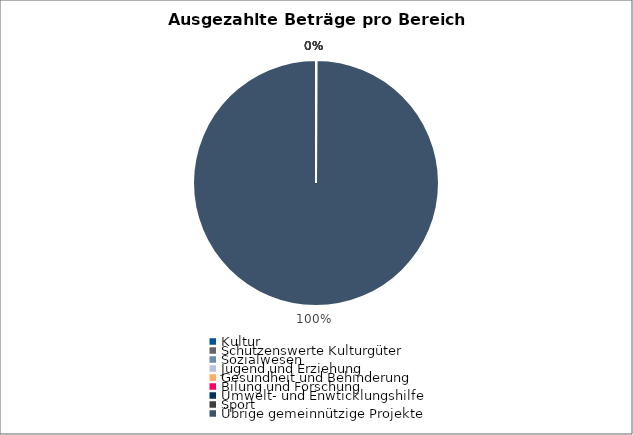
| Category | Series 0 |
|---|---|
| Kultur | 0 |
| Schützenswerte Kulturgüter | 0 |
| Sozialwesen | 0 |
| Jugend und Erziehung | 0 |
| Gesundheit und Behinderung | 0 |
| Bilung und Forschung | 0 |
| Umwelt- und Enwticklungshilfe | 0 |
| Sport | 0 |
| Übrige gemeinnützige Projekte | 29235 |